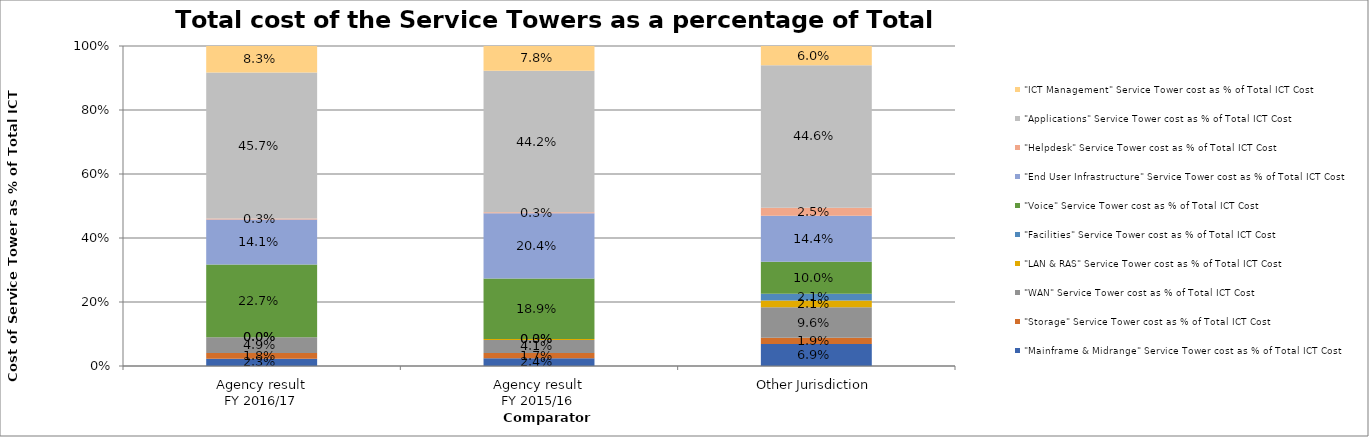
| Category | "Mainframe & Midrange" Service Tower cost as % of Total ICT Cost | "Storage" Service Tower cost as % of Total ICT Cost | "WAN" Service Tower cost as % of Total ICT Cost | "LAN & RAS" Service Tower cost as % of Total ICT Cost | "Facilities" Service Tower cost as % of Total ICT Cost | "Voice" Service Tower cost as % of Total ICT Cost | "End User Infrastructure" Service Tower cost as % of Total ICT Cost | "Helpdesk" Service Tower cost as % of Total ICT Cost | "Applications" Service Tower cost as % of Total ICT Cost | "ICT Management" Service Tower cost as % of Total ICT Cost |
|---|---|---|---|---|---|---|---|---|---|---|
| Agency result
FY 2016/17 | 0.022 | 0.018 | 0.049 | 0 | 0 | 0.227 | 0.141 | 0.003 | 0.457 | 0.083 |
| Agency result
FY 2015/16 | 0.024 | 0.016 | 0.041 | 0.003 | 0 | 0.189 | 0.204 | 0.003 | 0.442 | 0.078 |
| Other Jurisdiction | 0.069 | 0.019 | 0.096 | 0.021 | 0.021 | 0.1 | 0.144 | 0.025 | 0.446 | 0.06 |